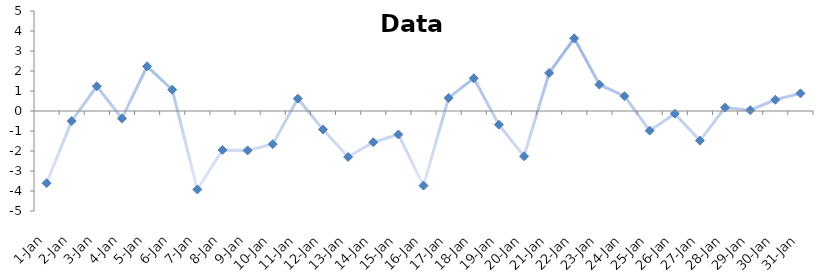
| Category | Data |
|---|---|
| 2011-01-01 | -3.61 |
| 2011-01-02 | -0.502 |
| 2011-01-03 | 1.239 |
| 2011-01-04 | -0.37 |
| 2011-01-05 | 2.233 |
| 2011-01-06 | 1.065 |
| 2011-01-07 | -3.922 |
| 2011-01-08 | -1.946 |
| 2011-01-09 | -1.97 |
| 2011-01-10 | -1.656 |
| 2011-01-11 | 0.618 |
| 2011-01-12 | -0.928 |
| 2011-01-13 | -2.297 |
| 2011-01-14 | -1.56 |
| 2011-01-15 | -1.175 |
| 2011-01-16 | -3.731 |
| 2011-01-17 | 0.653 |
| 2011-01-18 | 1.636 |
| 2011-01-19 | -0.683 |
| 2011-01-20 | -2.262 |
| 2011-01-21 | 1.901 |
| 2011-01-22 | 3.632 |
| 2011-01-23 | 1.321 |
| 2011-01-24 | 0.74 |
| 2011-01-25 | -0.982 |
| 2011-01-26 | -0.133 |
| 2011-01-27 | -1.479 |
| 2011-01-28 | 0.169 |
| 2011-01-29 | 0.042 |
| 2011-01-30 | 0.562 |
| 2011-01-31 | 0.882 |